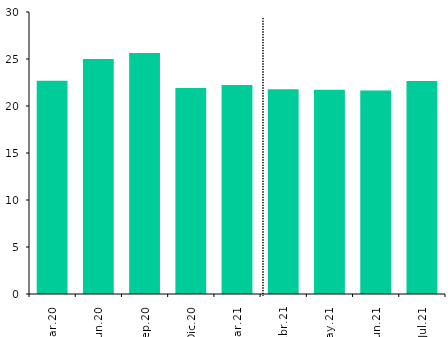
| Category | RCI |
|---|---|
| Mar.20 | 22.695 |
| Jun.20 | 25.009 |
| Sep.20 | 25.64 |
| Dic.20 | 21.925 |
| Mar.21 | 22.235 |
| Abr.21 | 21.778 |
| May.21 | 21.725 |
| Jun.21 | 21.657 |
| Jul.21 | 22.662 |